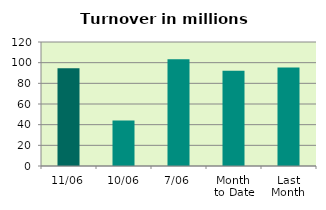
| Category | Series 0 |
|---|---|
| 11/06 | 94.533 |
| 10/06 | 44.072 |
| 7/06 | 103.262 |
| Month 
to Date | 92.07 |
| Last
Month | 95.269 |